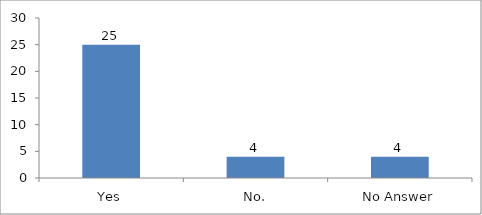
| Category | Would you like to recommend this session to your friend or colleague? |
|---|---|
| Yes | 25 |
| No. | 4 |
| No Answer | 4 |